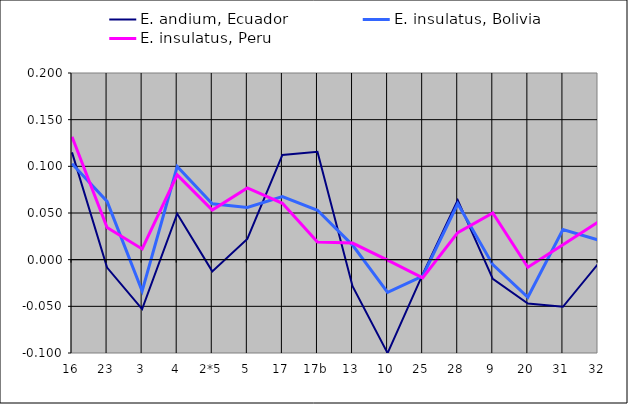
| Category | E. andium, Ecuador | E. insulatus, Bolivia | E. insulatus, Peru |
|---|---|---|---|
| 16 | 0.115 | 0.103 | 0.132 |
| 23 | -0.009 | 0.062 | 0.034 |
| 3 | -0.053 | -0.034 | 0.011 |
| 4 | 0.049 | 0.1 | 0.091 |
| 2*5 | -0.013 | 0.06 | 0.053 |
| 5 | 0.022 | 0.056 | 0.077 |
| 17 | 0.112 | 0.068 | 0.06 |
| 17b | 0.116 | 0.053 | 0.019 |
| 13 | -0.028 | 0.016 | 0.018 |
| 10 | -0.1 | -0.035 | -0.001 |
| 25 | -0.016 | -0.018 | -0.02 |
| 28 | 0.064 | 0.06 | 0.029 |
| 9 | -0.021 | -0.005 | 0.05 |
| 20 | -0.047 | -0.04 | -0.008 |
| 31 | -0.05 | 0.032 | 0.016 |
| 32 | -0.005 | 0.021 | 0.04 |